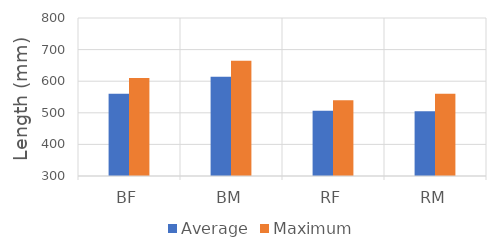
| Category | Average | Maximum |
|---|---|---|
| BF | 560 | 610 |
| BM | 614 | 665 |
| RF | 506.25 | 540 |
| RM | 505 | 560 |